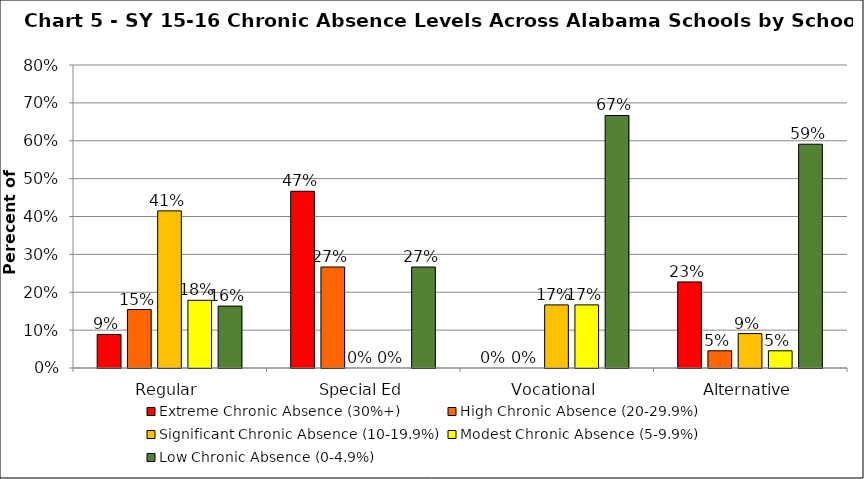
| Category | Extreme Chronic Absence (30%+) | High Chronic Absence (20-29.9%) | Significant Chronic Absence (10-19.9%) | Modest Chronic Absence (5-9.9%) | Low Chronic Absence (0-4.9%) |
|---|---|---|---|---|---|
| 0 | 0.089 | 0.154 | 0.415 | 0.179 | 0.163 |
| 1 | 0.467 | 0.267 | 0 | 0 | 0.267 |
| 2 | 0 | 0 | 0.167 | 0.167 | 0.667 |
| 3 | 0.227 | 0.045 | 0.091 | 0.045 | 0.591 |